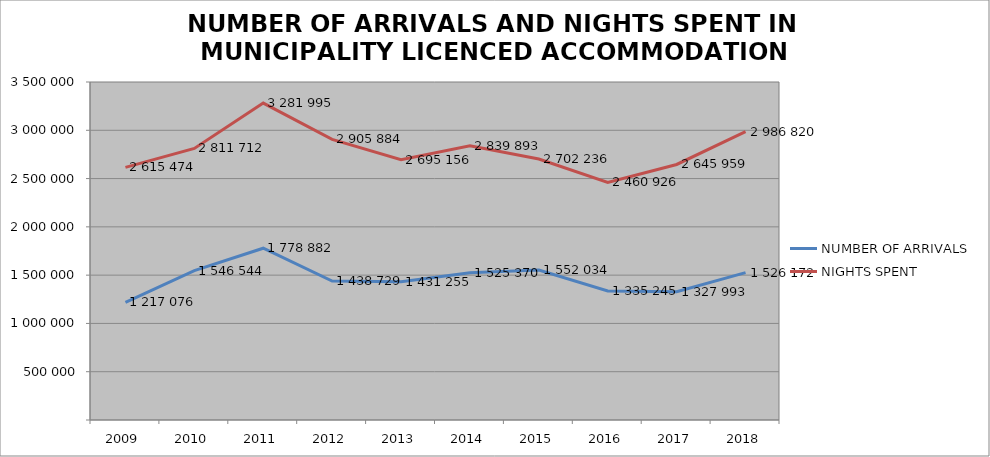
| Category | NUMBER OF ARRIVALS | NIGHTS SPENT |
|---|---|---|
| 2009 | 1217076 | 2615474 |
| 2010 | 1546544 | 2811712 |
| 2011 | 1778882 | 3281995 |
| 2012 | 1438729 | 2905884 |
| 2013 | 1431255 | 2695156 |
| 2014 | 1525370 | 2839893 |
| 2015 | 1552034 | 2702236 |
| 2016 | 1335245 | 2460926 |
| 2017 | 1327993 | 2645959 |
| 2018 | 1526172 | 2986820 |